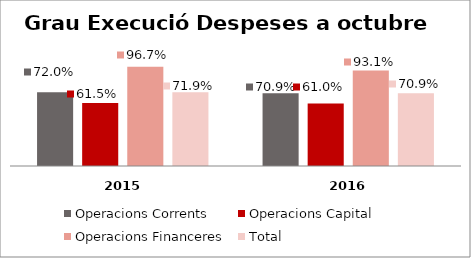
| Category | Operacions Corrents | Operacions Capital | Operacions Financeres | Total |
|---|---|---|---|---|
| 0 | 0.72 | 0.615 | 0.967 | 0.719 |
| 1 | 0.709 | 0.61 | 0.931 | 0.709 |